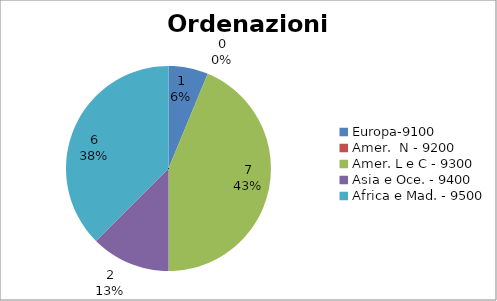
| Category | Series 0 |
|---|---|
| Europa-9100 | 1 |
| Amer.  N - 9200 | 0 |
| Amer. L e C - 9300 | 7 |
| Asia e Oce. - 9400 | 2 |
| Africa e Mad. - 9500 | 6 |